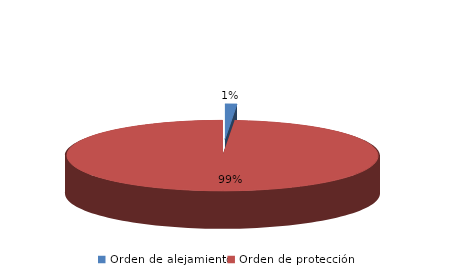
| Category | Series 0 |
|---|---|
| Orden de alejamiento | 1 |
| Orden de protección | 81 |